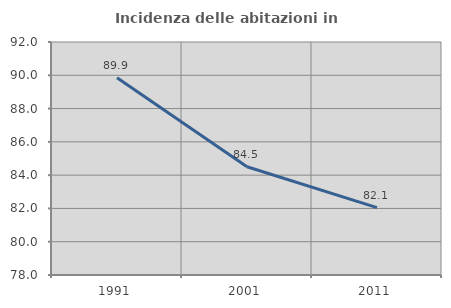
| Category | Incidenza delle abitazioni in proprietà  |
|---|---|
| 1991.0 | 89.855 |
| 2001.0 | 84.507 |
| 2011.0 | 82.051 |